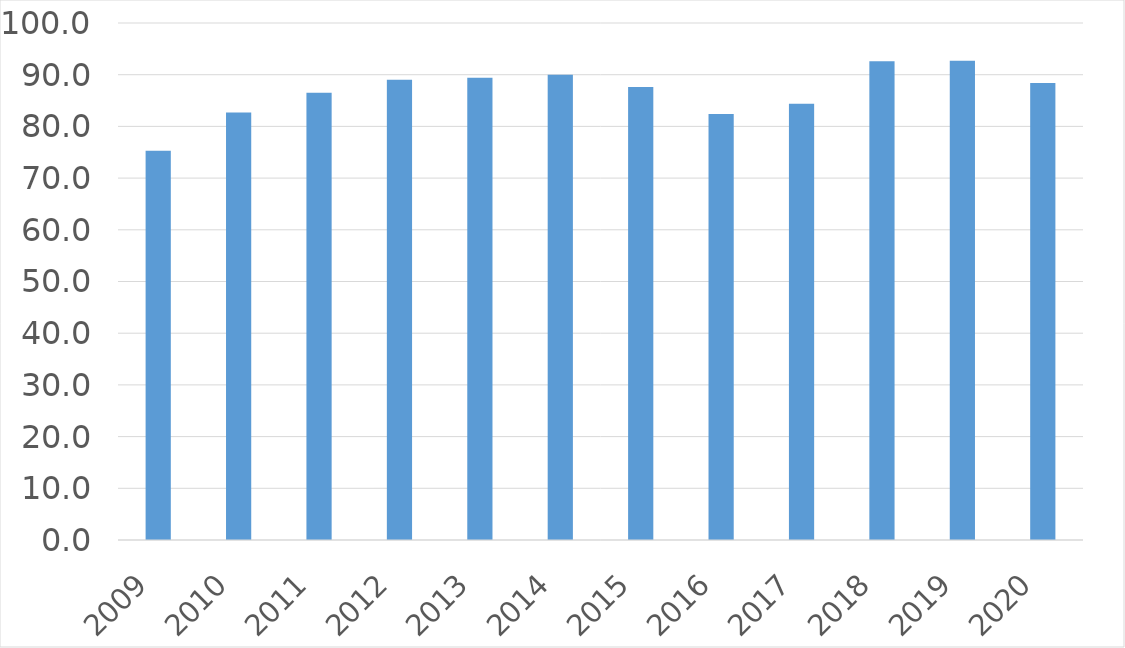
| Category | Series 0 |
|---|---|
| 2009 | 75.3 |
| 2010 | 82.7 |
| 2011 | 86.5 |
| 2012 | 89 |
| 2013 | 89.4 |
| 2014 | 90 |
| 2015 | 87.6 |
| 2016 | 82.4 |
| 2017 | 84.4 |
| 2018 | 92.6 |
| 2019 | 92.7 |
| 2020 | 88.4 |